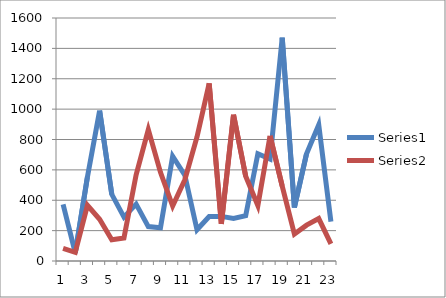
| Category | Series 0 | Series 1 |
|---|---|---|
| 0 | 373.333 | 83.333 |
| 1 | 53.333 | 57.333 |
| 2 | 553.333 | 366.667 |
| 3 | 989.667 | 274.667 |
| 4 | 439 | 140.333 |
| 5 | 289 | 151.333 |
| 6 | 374.333 | 567.667 |
| 7 | 226.667 | 865.667 |
| 8 | 219.333 | 583.667 |
| 9 | 690 | 362 |
| 10 | 565.333 | 534.667 |
| 11 | 206 | 816.667 |
| 12 | 293.333 | 1169.667 |
| 13 | 293.667 | 244.333 |
| 14 | 280.667 | 962.5 |
| 15 | 298 | 558.5 |
| 16 | 706 | 365.5 |
| 17 | 671.333 | 824 |
| 18 | 1470.333 | 492.5 |
| 19 | 352 | 177 |
| 20 | 706.667 | 236 |
| 21 | 896.667 | 279.5 |
| 22 | 259.667 | 112.5 |